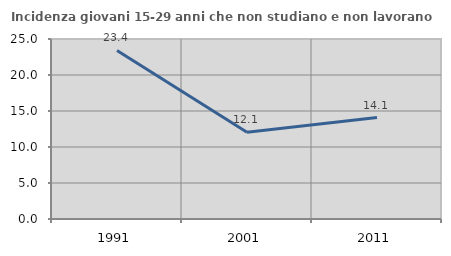
| Category | Incidenza giovani 15-29 anni che non studiano e non lavorano  |
|---|---|
| 1991.0 | 23.413 |
| 2001.0 | 12.06 |
| 2011.0 | 14.091 |